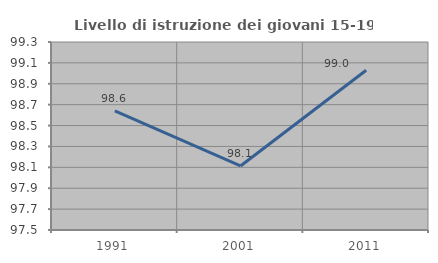
| Category | Livello di istruzione dei giovani 15-19 anni |
|---|---|
| 1991.0 | 98.639 |
| 2001.0 | 98.113 |
| 2011.0 | 99.029 |